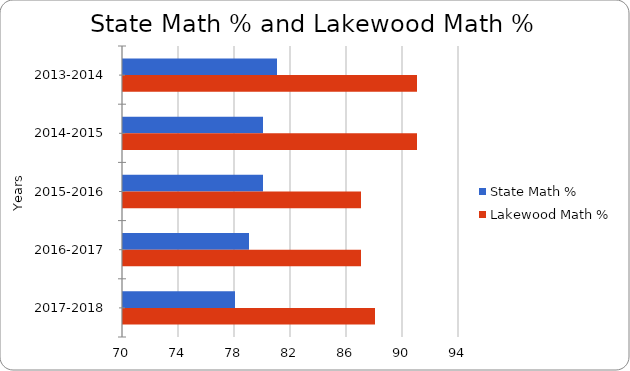
| Category | State Math % | Lakewood Math % |
|---|---|---|
| 2013-2014 | 81 | 91 |
| 2014-2015 | 80 | 91 |
| 2015-2016 | 80 | 87 |
| 2016-2017 | 79 | 87 |
| 2017-2018 | 78 | 88 |